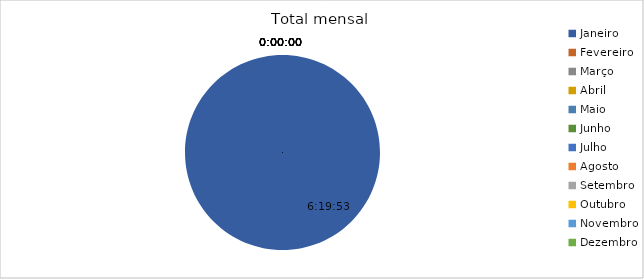
| Category | Total |
|---|---|
| Janeiro | 0.264 |
| Fevereiro | 0 |
| Março | 0 |
| Abril | 0 |
| Maio | 0 |
| Junho | 0 |
| Julho | 0 |
| Agosto | 0 |
| Setembro | 0 |
| Outubro | 0 |
| Novembro | 0 |
| Dezembro | 0 |